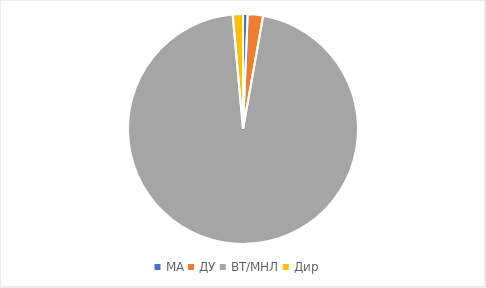
| Category | Сумма |
|---|---|
| МА | 246000 |
| ДУ | 818181.9 |
| ВТ/МНЛ | 36371223.1 |
| Дир | 545454.5 |